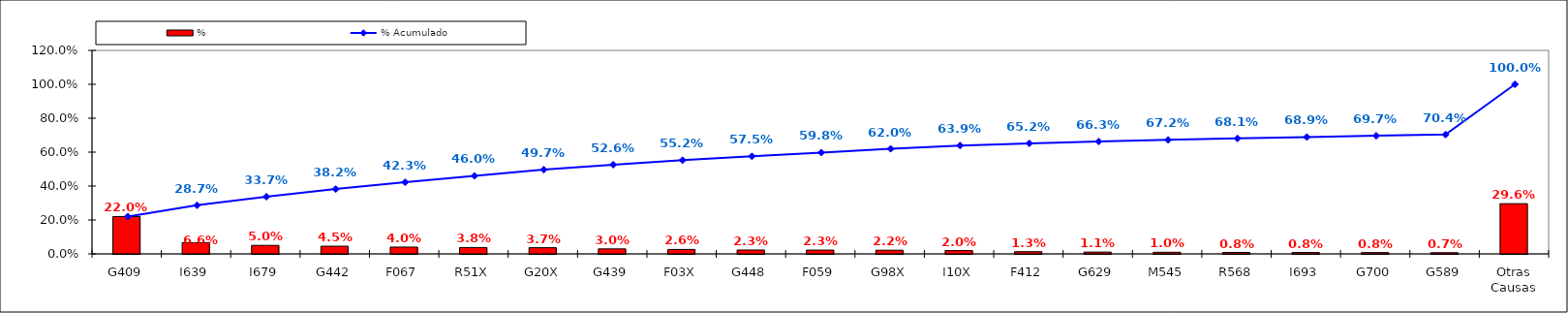
| Category | % |
|---|---|
| G409 | 0.22 |
| I639 | 0.066 |
| I679 | 0.05 |
| G442 | 0.045 |
| F067 | 0.04 |
| R51X | 0.038 |
| G20X | 0.037 |
| G439 | 0.03 |
| F03X | 0.026 |
| G448 | 0.023 |
| F059 | 0.023 |
| G98X | 0.022 |
| I10X | 0.02 |
| F412 | 0.013 |
| G629 | 0.011 |
| M545 | 0.01 |
| R568 | 0.008 |
| I693 | 0.008 |
| G700 | 0.008 |
| G589 | 0.007 |
| Otras Causas | 0.296 |